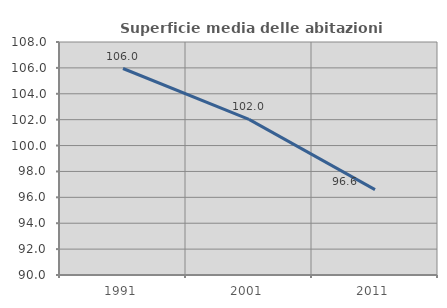
| Category | Superficie media delle abitazioni occupate |
|---|---|
| 1991.0 | 105.952 |
| 2001.0 | 102.018 |
| 2011.0 | 96.599 |